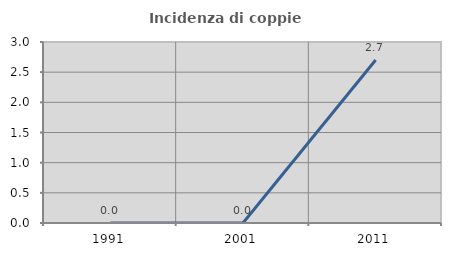
| Category | Incidenza di coppie miste |
|---|---|
| 1991.0 | 0 |
| 2001.0 | 0 |
| 2011.0 | 2.703 |